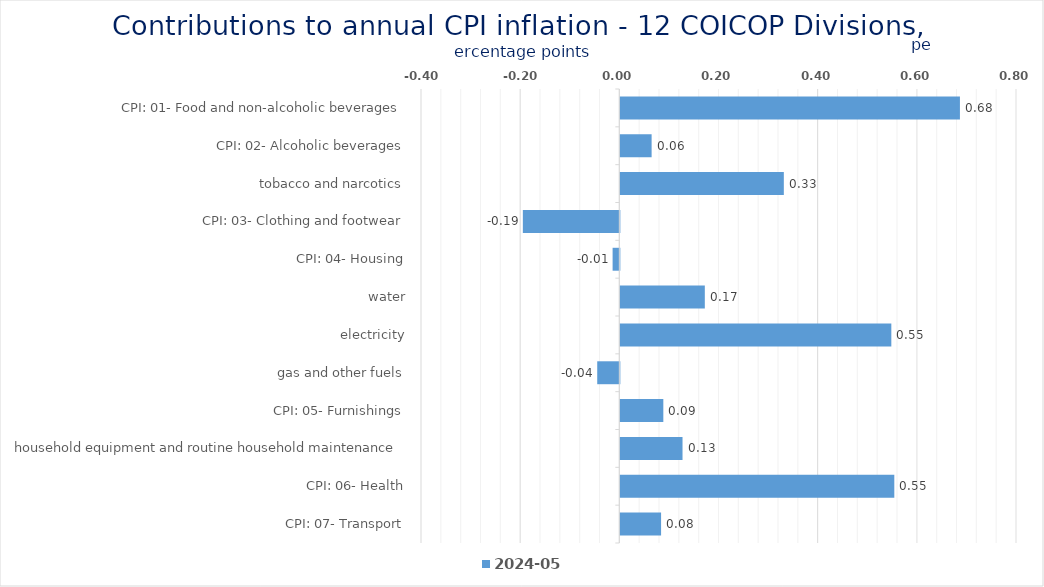
| Category | 2024-05 |
|---|---|
| CPI: 01- Food and non-alcoholic beverages | 0.685 |
| CPI: 02- Alcoholic beverages, tobacco and narcotics | 0.063 |
| CPI: 03- Clothing and footwear | 0.33 |
| CPI: 04- Housing, water, electricity, gas and other fuels | -0.195 |
| CPI: 05- Furnishings, household equipment and routine household maintenance | -0.014 |
| CPI: 06- Health | 0.17 |
| CPI: 07- Transport | 0.547 |
| CPI: 08- Communication | -0.045 |
| CPI: 09- Recreation and culture | 0.087 |
| CPI: 10- Education | 0.125 |
| CPI: 11- Restaurants and hotels | 0.553 |
| CPI: 12- Miscellaneous goods and services | 0.082 |